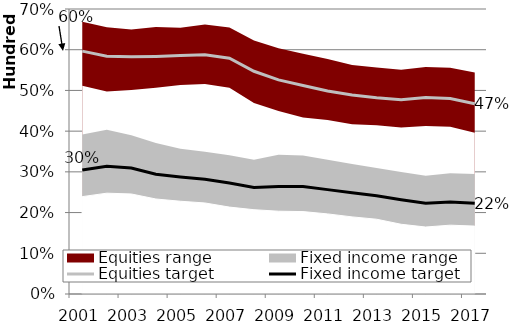
| Category | Equities target | Fixed income target |
|---|---|---|
| 0 | 59.65 | 30.471 |
| 1 | 58.392 | 31.391 |
| 2 | 58.26 | 30.932 |
| 3 | 58.346 | 29.426 |
| 4 | 58.557 | 28.749 |
| 5 | 58.755 | 28.162 |
| 6 | 57.897 | 27.279 |
| 7 | 54.705 | 26.177 |
| 8 | 52.592 | 26.423 |
| 9 | 51.207 | 26.424 |
| 10 | 49.879 | 25.635 |
| 11 | 48.862 | 24.887 |
| 12 | 48.186 | 24.151 |
| 13 | 47.729 | 23.169 |
| 14 | 48.262 | 22.319 |
| 15 | 48.018 | 22.572 |
| 16 | 46.739 | 22.265 |